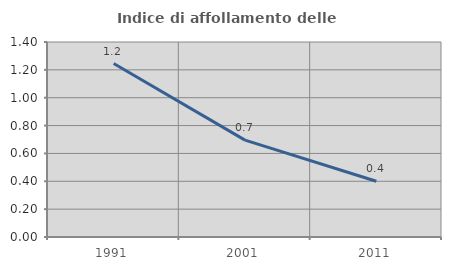
| Category | Indice di affollamento delle abitazioni  |
|---|---|
| 1991.0 | 1.245 |
| 2001.0 | 0.696 |
| 2011.0 | 0.4 |